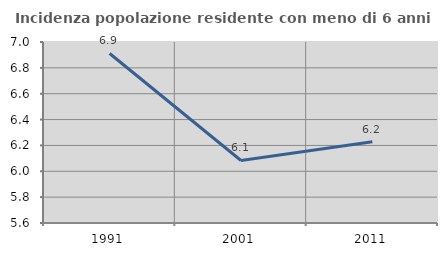
| Category | Incidenza popolazione residente con meno di 6 anni |
|---|---|
| 1991.0 | 6.911 |
| 2001.0 | 6.084 |
| 2011.0 | 6.228 |